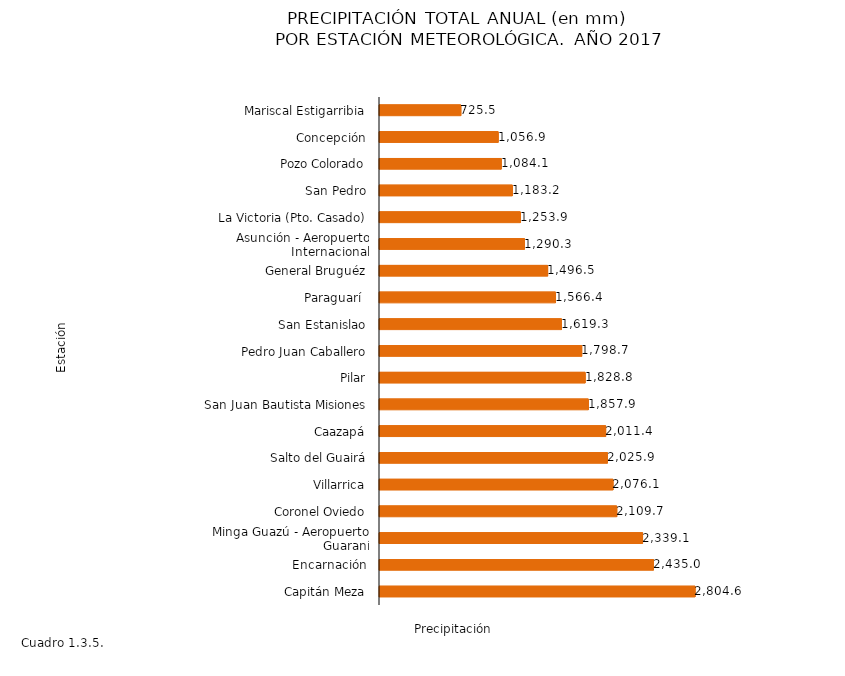
| Category | Series 0 |
|---|---|
| Capitán Meza | 2804.6 |
| Encarnación | 2435 |
| Minga Guazú - Aeropuerto Guaraní | 2339.1 |
| Coronel Oviedo | 2109.7 |
| Villarrica | 2076.1 |
| Salto del Guairá | 2025.9 |
| Caazapá | 2011.4 |
| San Juan Bautista Misiones | 1857.9 |
| Pilar | 1828.8 |
| Pedro Juan Caballero | 1798.7 |
| San Estanislao | 1619.3 |
| Paraguarí  | 1566.4 |
| General Bruguéz | 1496.5 |
| Asunción - Aeropuerto Internacional | 1290.3 |
| La Victoria (Pto. Casado) | 1253.9 |
| San Pedro | 1183.2 |
| Pozo Colorado | 1084.1 |
| Concepción | 1056.9 |
| Mariscal Estigarribia | 725.5 |